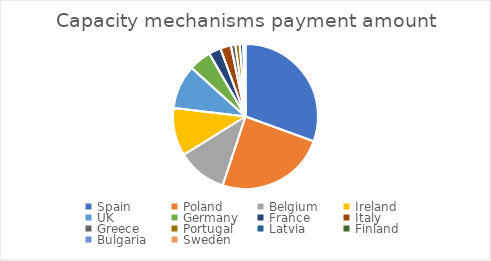
| Category | Capacity mechanisms payment amount |
|---|---|
| Spain | 17892279611.54 |
| Poland | 14373976500 |
| Belgium | 6478256000 |
| Ireland | 6282712578.127 |
| UK | 5724181706.817 |
| Germany | 2937120000 |
| France | 1571091629.39 |
| Italy | 1400000000 |
| Greece | 582118012 |
| Portugal | 570376800 |
| Latvia  | 454000000 |
| Finland | 155078574 |
| Bulgaria | 96321898.137 |
| Sweden | 40426194.537 |